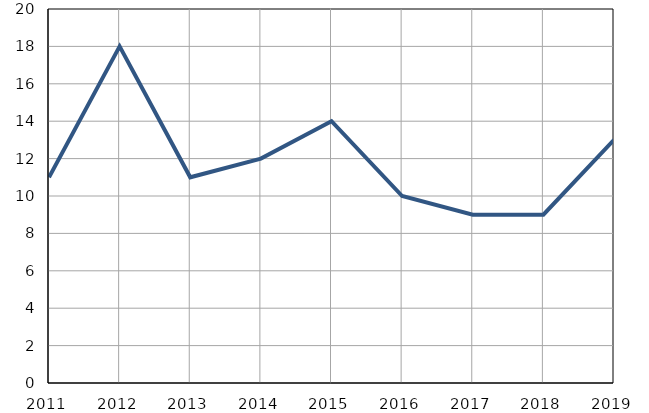
| Category | Умрла 
одојчад |
|---|---|
| 2011.0 | 11 |
| 2012.0 | 18 |
| 2013.0 | 11 |
| 2014.0 | 12 |
| 2015.0 | 14 |
| 2016.0 | 10 |
| 2017.0 | 9 |
| 2018.0 | 9 |
| 2019.0 | 13 |